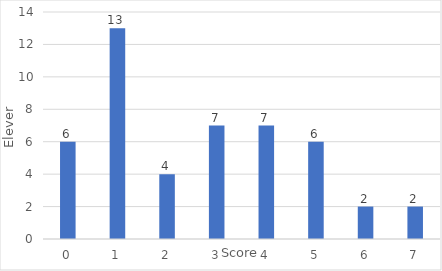
| Category | Series 0 |
|---|---|
| 0.0 | 6 |
| 1.0 | 13 |
| 2.0 | 4 |
| 3.0 | 7 |
| 4.0 | 7 |
| 5.0 | 6 |
| 6.0 | 2 |
| 7.0 | 2 |